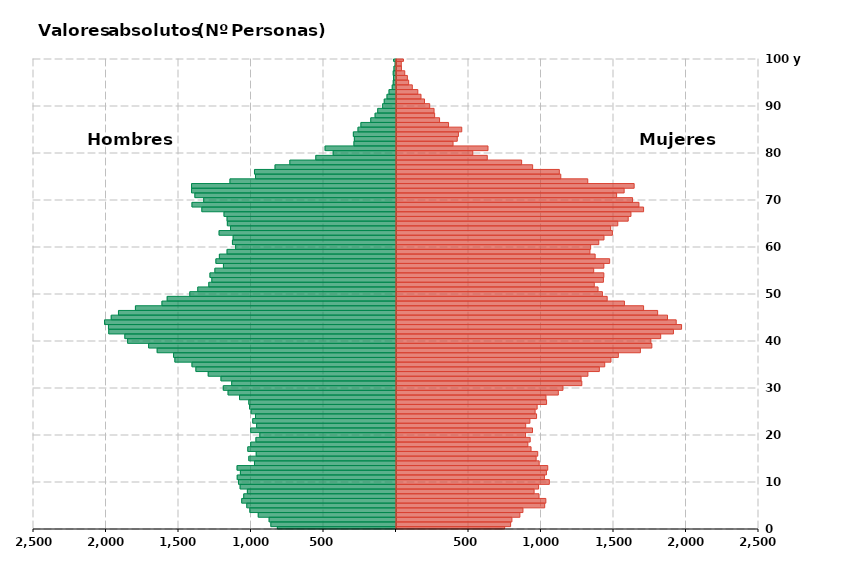
| Category | Hombres | Mujeres |
|---|---|---|
| 0 | -818 | 746 |
| 1 | -863 | 787 |
| 2 | -875 | 796 |
| 3 | -950 | 851 |
| 4 | -1008 | 872 |
| 5 | -1029 | 1022 |
| 6 | -1064 | 1030 |
| 7 | -1050 | 983 |
| 8 | -1025 | 949 |
| 9 | -1075 | 980 |
| 10 | -1086 | 1054 |
| 11 | -1095 | 1020 |
| 12 | -1073 | 1034 |
| 13 | -1096 | 1043 |
| 14 | -976 | 984 |
| 15 | -1015 | 963 |
| 16 | -964 | 974 |
| 17 | -1022 | 928 |
| 18 | -1002 | 906 |
| 19 | -966 | 922 |
| 20 | -939 | 890 |
| 21 | -1002 | 938 |
| 22 | -961 | 891 |
| 23 | -988 | 920 |
| 24 | -969 | 966 |
| 25 | -999 | 956 |
| 26 | -1010 | 970 |
| 27 | -1015 | 1035 |
| 28 | -1079 | 1031 |
| 29 | -1158 | 1116 |
| 30 | -1191 | 1148 |
| 31 | -1133 | 1278 |
| 32 | -1207 | 1273 |
| 33 | -1295 | 1320 |
| 34 | -1380 | 1399 |
| 35 | -1407 | 1436 |
| 36 | -1525 | 1479 |
| 37 | -1534 | 1530 |
| 38 | -1647 | 1682 |
| 39 | -1706 | 1761 |
| 40 | -1851 | 1754 |
| 41 | -1870 | 1822 |
| 42 | -1981 | 1910 |
| 43 | -1983 | 1966 |
| 44 | -2010 | 1929 |
| 45 | -1964 | 1869 |
| 46 | -1914 | 1801 |
| 47 | -1797 | 1704 |
| 48 | -1614 | 1572 |
| 49 | -1578 | 1453 |
| 50 | -1422 | 1420 |
| 51 | -1367 | 1390 |
| 52 | -1291 | 1364 |
| 53 | -1270 | 1427 |
| 54 | -1283 | 1430 |
| 55 | -1249 | 1360 |
| 56 | -1190 | 1430 |
| 57 | -1242 | 1470 |
| 58 | -1218 | 1370 |
| 59 | -1165 | 1334 |
| 60 | -1106 | 1339 |
| 61 | -1128 | 1395 |
| 62 | -1123 | 1431 |
| 63 | -1220 | 1489 |
| 64 | -1141 | 1477 |
| 65 | -1163 | 1526 |
| 66 | -1165 | 1598 |
| 67 | -1186 | 1617 |
| 68 | -1339 | 1704 |
| 69 | -1407 | 1672 |
| 70 | -1326 | 1628 |
| 71 | -1387 | 1518 |
| 72 | -1410 | 1570 |
| 73 | -1410 | 1639 |
| 74 | -1145 | 1319 |
| 75 | -969 | 1133 |
| 76 | -976 | 1123 |
| 77 | -834 | 939 |
| 78 | -732 | 863 |
| 79 | -553 | 626 |
| 80 | -433 | 526 |
| 81 | -489 | 631 |
| 82 | -290 | 390 |
| 83 | -287 | 419 |
| 84 | -294 | 427 |
| 85 | -262 | 450 |
| 86 | -242 | 359 |
| 87 | -174 | 297 |
| 88 | -144 | 263 |
| 89 | -126 | 259 |
| 90 | -92 | 229 |
| 91 | -81 | 193 |
| 92 | -62 | 169 |
| 93 | -48 | 147 |
| 94 | -26 | 109 |
| 95 | -19 | 84 |
| 96 | -17 | 75 |
| 97 | -19 | 57 |
| 98 | -14 | 34 |
| 99 | -6 | 33 |
| 100 y más | -17 | 48 |